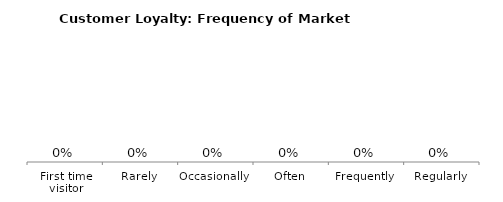
| Category | Series 0 |
|---|---|
| First time visitor | 0 |
| Rarely | 0 |
| Occasionally | 0 |
| Often | 0 |
| Frequently | 0 |
| Regularly | 0 |